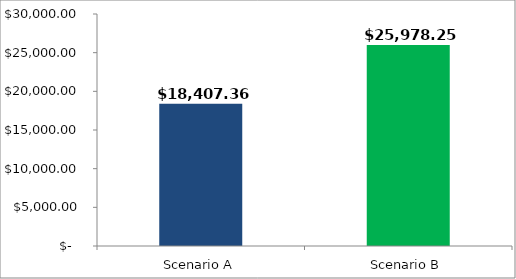
| Category | Starting Annual Income in Retirement: |
|---|---|
| Scenario A | 18407.359 |
| Scenario B | 25978.255 |